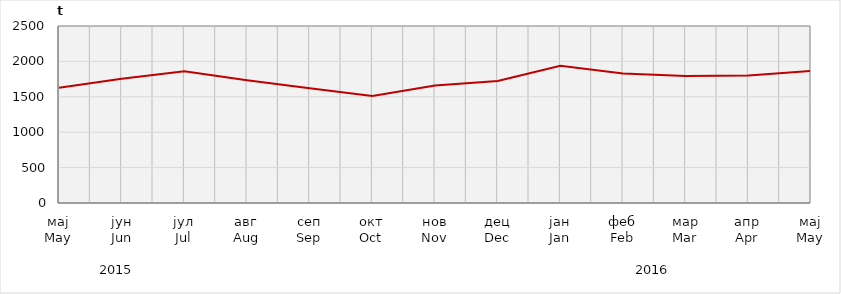
| Category | Нето тежина заклане стоке                              Net weight of  slaughtered livestock |
|---|---|
| мај
May | 1628212.69 |
| јун
Jun | 1753845.16 |
| јул
Jul | 1862492.5 |
| авг
Aug | 1733294.8 |
| сеп
Sep | 1619599 |
| окт
Oct | 1511667.7 |
| нов
Nov | 1658700 |
| дец
Dec | 1721996.5 |
| јан
Jan | 1938649.7 |
| феб
Feb | 1828587.85 |
| мар
Mar | 1792740.7 |
| апр
Apr | 1800600 |
| мај
May | 1866665 |